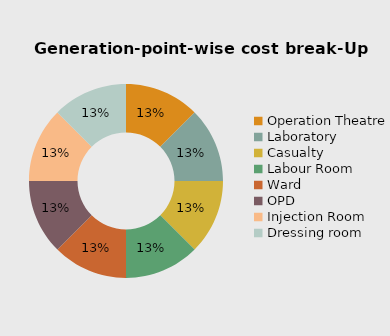
| Category | Series 0 |
|---|---|
| Operation Theatre | 16015 |
| Laboratory | 16015 |
| Casualty  | 16015 |
| Labour Room | 16015 |
| Ward  | 16015 |
| OPD | 16015 |
| Injection Room | 16015 |
| Dressing room | 16015 |